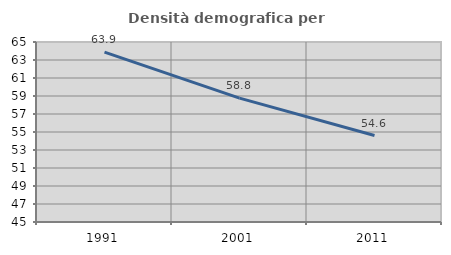
| Category | Densità demografica |
|---|---|
| 1991.0 | 63.883 |
| 2001.0 | 58.758 |
| 2011.0 | 54.611 |